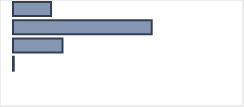
| Category | Series 0 |
|---|---|
| 0 | 16.769 |
| 1 | 61.1 |
| 2 | 21.808 |
| 3 | 0.323 |
| 4 | 0 |